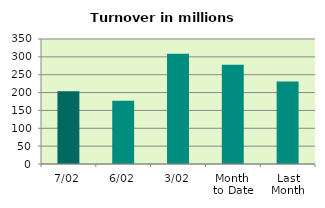
| Category | Series 0 |
|---|---|
| 7/02 | 203.568 |
| 6/02 | 177.431 |
| 3/02 | 308.481 |
| Month 
to Date | 277.691 |
| Last
Month | 231.348 |